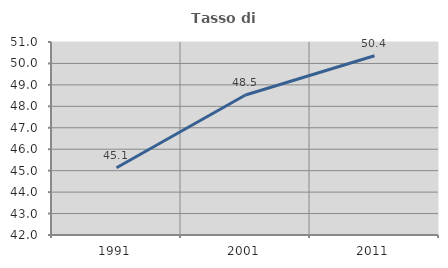
| Category | Tasso di occupazione   |
|---|---|
| 1991.0 | 45.135 |
| 2001.0 | 48.527 |
| 2011.0 | 50.358 |